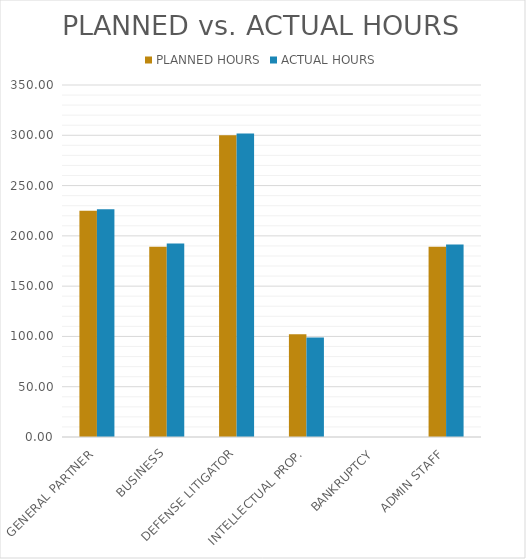
| Category | PLANNED HOURS | ACTUAL HOURS |
|---|---|---|
| GENERAL PARTNER | 225 | 226.5 |
| BUSINESS | 189.286 | 192.5 |
| DEFENSE LITIGATOR | 300 | 301.714 |
| INTELLECTUAL PROP. | 102.143 | 99 |
| BANKRUPTCY | 0 | 0 |
| ADMIN STAFF | 189.286 | 191.429 |